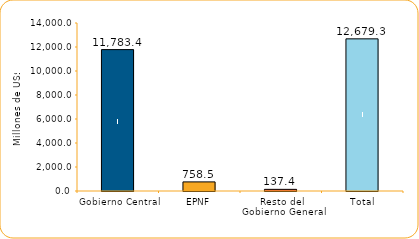
| Category | Series 1 |
|---|---|
| Gobierno Central | 11783.4 |
| EPNF | 758.5 |
| Resto del Gobierno General | 137.4 |
| Total | 12679.3 |